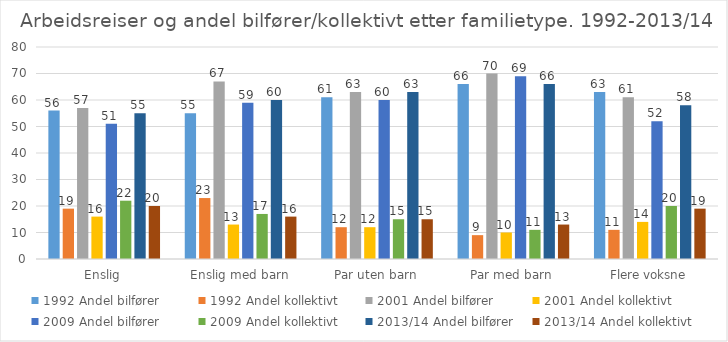
| Category | 1992 | 2001 | 2009 | 2013/14 |
|---|---|---|---|---|
| Enslig | 19 | 16 | 22 | 20 |
| Enslig med barn | 23 | 13 | 17 | 16 |
| Par uten barn | 12 | 12 | 15 | 15 |
| Par med barn | 9 | 10 | 11 | 13 |
| Flere voksne | 11 | 14 | 20 | 19 |